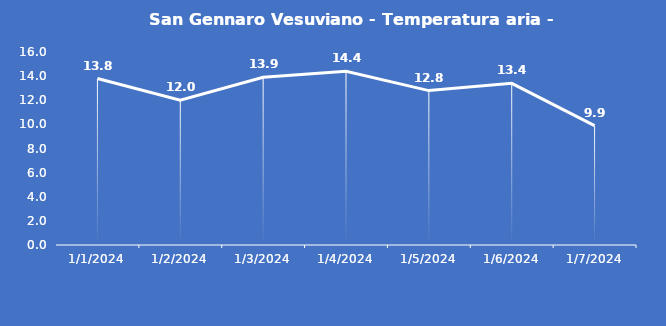
| Category | San Gennaro Vesuviano - Temperatura aria - Grezzo (°C) |
|---|---|
| 1/1/24 | 13.8 |
| 1/2/24 | 12 |
| 1/3/24 | 13.9 |
| 1/4/24 | 14.4 |
| 1/5/24 | 12.8 |
| 1/6/24 | 13.4 |
| 1/7/24 | 9.9 |